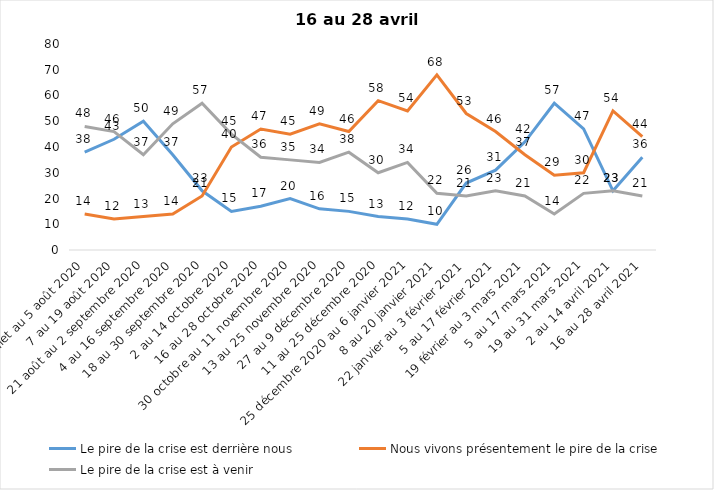
| Category | Le pire de la crise est derrière nous | Nous vivons présentement le pire de la crise | Le pire de la crise est à venir |
|---|---|---|---|
| 24 juillet au 5 août 2020 | 38 | 14 | 48 |
| 7 au 19 août 2020 | 43 | 12 | 46 |
| 21 août au 2 septembre 2020 | 50 | 13 | 37 |
| 4 au 16 septembre 2020 | 37 | 14 | 49 |
| 18 au 30 septembre 2020 | 23 | 21 | 57 |
| 2 au 14 octobre 2020 | 15 | 40 | 45 |
| 16 au 28 octobre 2020 | 17 | 47 | 36 |
| 30 octobre au 11 novembre 2020 | 20 | 45 | 35 |
| 13 au 25 novembre 2020 | 16 | 49 | 34 |
| 27 au 9 décembre 2020 | 15 | 46 | 38 |
| 11 au 25 décembre 2020 | 13 | 58 | 30 |
| 25 décembre 2020 au 6 janvier 2021 | 12 | 54 | 34 |
| 8 au 20 janvier 2021 | 10 | 68 | 22 |
| 22 janvier au 3 février 2021 | 26 | 53 | 21 |
| 5 au 17 février 2021 | 31 | 46 | 23 |
| 19 février au 3 mars 2021 | 42 | 37 | 21 |
| 5 au 17 mars 2021 | 57 | 29 | 14 |
| 19 au 31 mars 2021 | 47 | 30 | 22 |
| 2 au 14 avril 2021 | 23 | 54 | 23 |
| 16 au 28 avril 2021 | 36 | 44 | 21 |